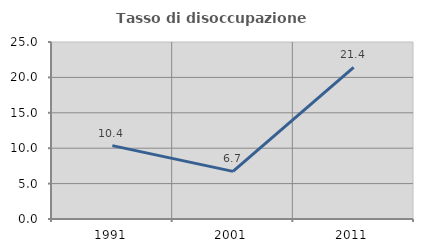
| Category | Tasso di disoccupazione giovanile  |
|---|---|
| 1991.0 | 10.366 |
| 2001.0 | 6.723 |
| 2011.0 | 21.429 |